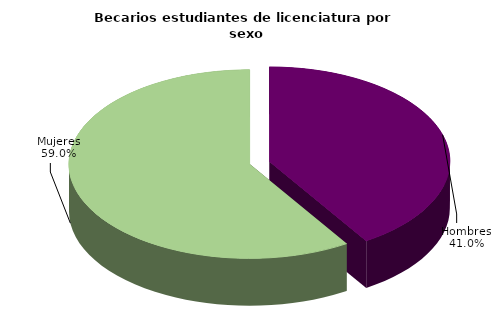
| Category | Series 0 |
|---|---|
| Hombres | 39698 |
| Mujeres | 57180 |